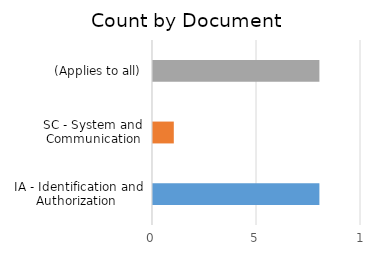
| Category | Count |
|---|---|
| IA - Identification and Authorization  | 8 |
| SC - System and Communication | 1 |
| (Applies to all) | 8 |